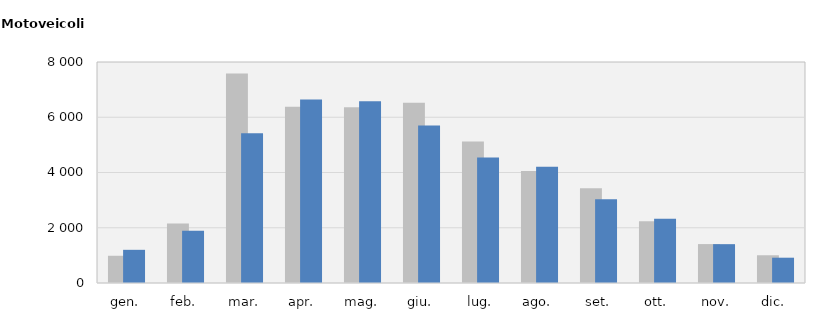
| Category | 2017 | 2018 |
|---|---|---|
| gen. | 986 | 1201 |
| feb. | 2158 | 1887 |
| mar. | 7581 | 5418 |
| apr. | 6380 | 6639 |
| mag. | 6363 | 6579 |
| giu. | 6529 | 5705 |
| lug. | 5119 | 4543 |
| ago. | 4056 | 4210 |
| set. | 3432 | 3029 |
| ott. | 2238 | 2322 |
| nov. | 1409 | 1406 |
| dic. | 1004 | 916 |